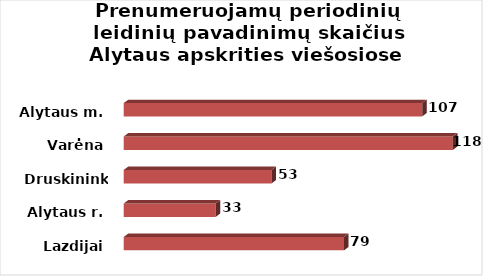
| Category | Alytaus m. Alytaus r. Druskininkai Lazdijai Varėna |
|---|---|
| Lazdijai | 79 |
| Alytaus r. | 33 |
| Druskininkai | 53 |
| Varėna | 118 |
| Alytaus m. | 107 |